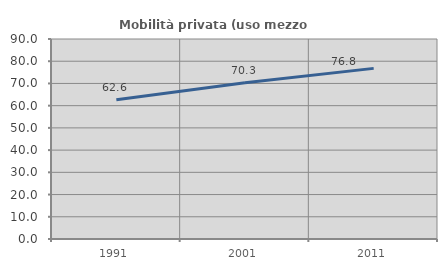
| Category | Mobilità privata (uso mezzo privato) |
|---|---|
| 1991.0 | 62.621 |
| 2001.0 | 70.27 |
| 2011.0 | 76.777 |